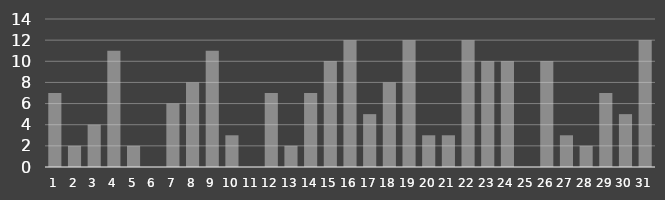
| Category | Opportunities |
|---|---|
| 1.0 | 7 |
| 2.0 | 2 |
| 3.0 | 4 |
| 4.0 | 11 |
| 5.0 | 2 |
| 6.0 | 0 |
| 7.0 | 6 |
| 8.0 | 8 |
| 9.0 | 11 |
| 10.0 | 3 |
| 11.0 | 0 |
| 12.0 | 7 |
| 13.0 | 2 |
| 14.0 | 7 |
| 15.0 | 10 |
| 16.0 | 12 |
| 17.0 | 5 |
| 18.0 | 8 |
| 19.0 | 12 |
| 20.0 | 3 |
| 21.0 | 3 |
| 22.0 | 12 |
| 23.0 | 10 |
| 24.0 | 10 |
| 25.0 | 0 |
| 26.0 | 10 |
| 27.0 | 3 |
| 28.0 | 2 |
| 29.0 | 7 |
| 30.0 | 5 |
| 31.0 | 12 |